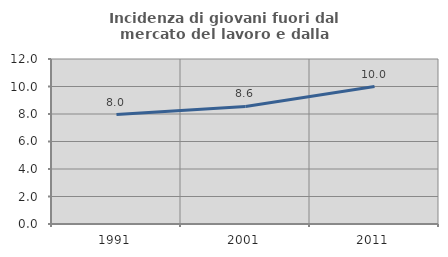
| Category | Incidenza di giovani fuori dal mercato del lavoro e dalla formazione  |
|---|---|
| 1991.0 | 7.96 |
| 2001.0 | 8.553 |
| 2011.0 | 10 |